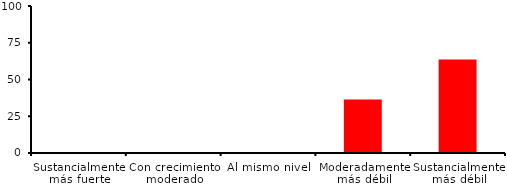
| Category | Series 0 |
|---|---|
| Sustancialmente más fuerte | 0 |
| Con crecimiento moderado | 0 |
| Al mismo nivel | 0 |
| Moderadamente más débil | 36.364 |
| Sustancialmente más débil | 63.636 |